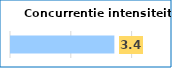
| Category | Series 0 |
|---|---|
| 0 | 3.4 |